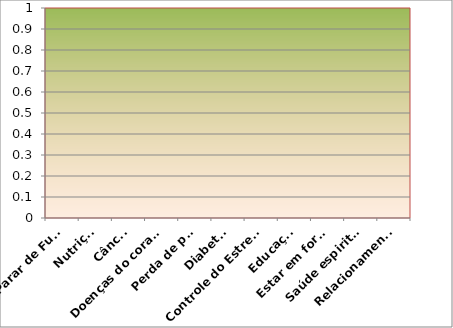
| Category | Series 0 | Series 1 |
|---|---|---|
| Parar de Fumar |  | 0 |
| Nutrição |  | 0 |
| Câncer |  | 0 |
| Doenças do coração |  | 0 |
| Perda de peso |  | 0 |
| Diabetes |  | 0 |
| Controle do Estresse |  | 0 |
| Educação |  | 0 |
| Estar em forma |  | 0 |
| Saúde espiritual |  | 0 |
| Relacionamentos |  | 0 |